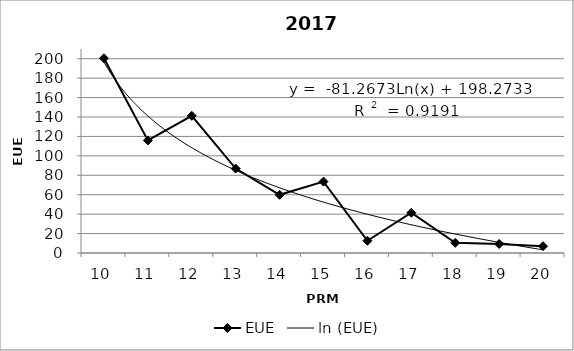
| Category | EUE |
|---|---|
| 10.0 | 200.449 |
| 11.0 | 115.86 |
| 12.0 | 141.251 |
| 13.0 | 86.901 |
| 14.0 | 59.89 |
| 15.0 | 73.491 |
| 16.0 | 12.606 |
| 17.0 | 41.41 |
| 18.0 | 10.462 |
| 19.0 | 9.32 |
| 20.0 | 7.001 |